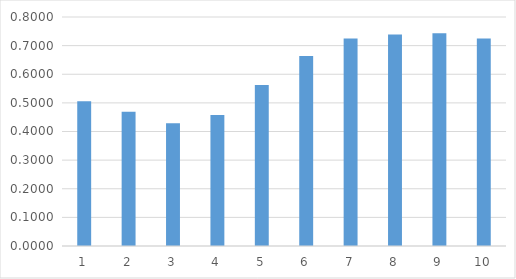
| Category | Series 0 |
|---|---|
| 0 | 0.506 |
| 1 | 0.469 |
| 2 | 0.429 |
| 3 | 0.458 |
| 4 | 0.563 |
| 5 | 0.663 |
| 6 | 0.725 |
| 7 | 0.739 |
| 8 | 0.743 |
| 9 | 0.725 |